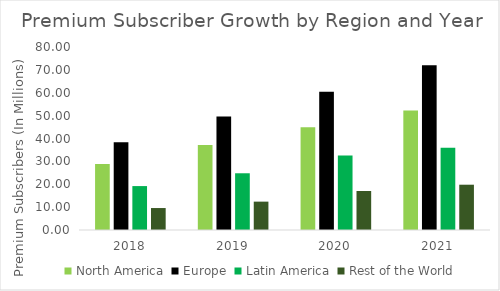
| Category | North America | Europe | Latin America | Rest of the World |
|---|---|---|---|---|
| 2018.0 | 28.8 | 38.4 | 19.2 | 9.6 |
| 2019.0 | 37.2 | 49.6 | 24.8 | 12.4 |
| 2020.0 | 44.95 | 60.45 | 32.55 | 17.05 |
| 2021.0 | 52.2 | 72 | 36 | 19.8 |